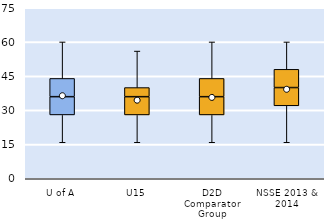
| Category | 25th | 50th | 75th |
|---|---|---|---|
| U of A | 28 | 8 | 8 |
| U15 | 28 | 8 | 4 |
| D2D Comparator Group | 28 | 8 | 8 |
| NSSE 2013 & 2014 | 32 | 8 | 8 |